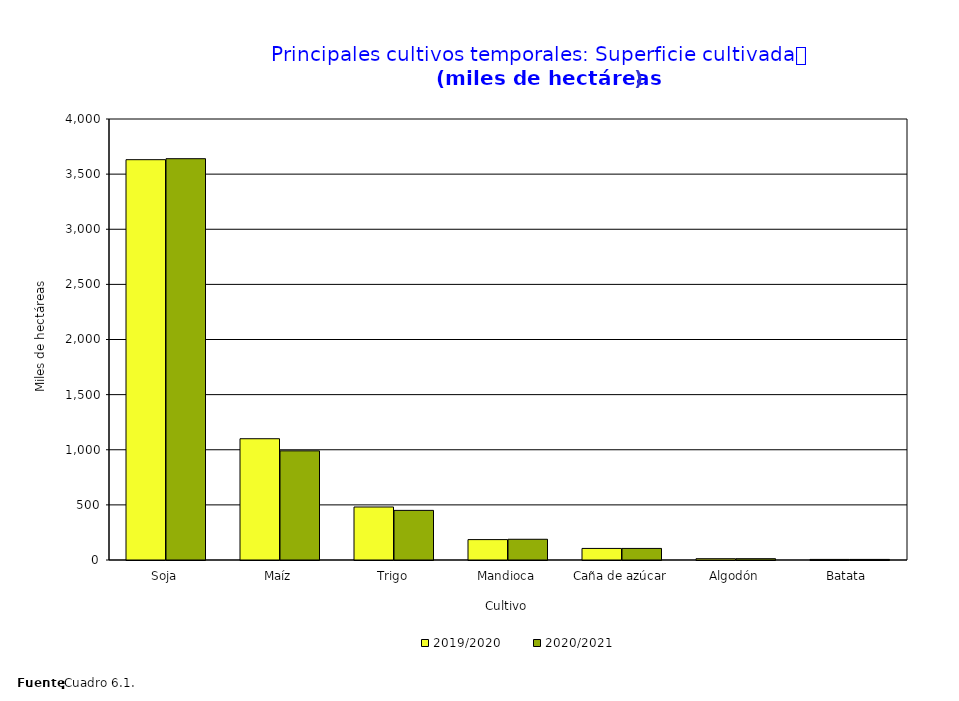
| Category | 2019/2020 | 2020/2021 |
|---|---|---|
| Soja | 3631 | 3640 |
| Maíz | 1100 | 990 |
| Trigo | 480.8 | 450 |
| Mandioca | 185 | 188 |
| Caña de azúcar | 105 | 105 |
| Algodón | 11.8 | 12 |
| Batata  | 5.271 | 5.289 |